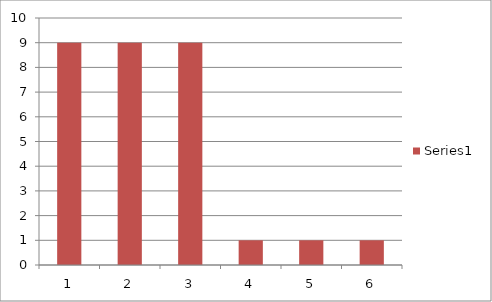
| Category | Series 1 |
|---|---|
| 0 | 9 |
| 1 | 9 |
| 2 | 9 |
| 3 | 1 |
| 4 | 1 |
| 5 | 1 |